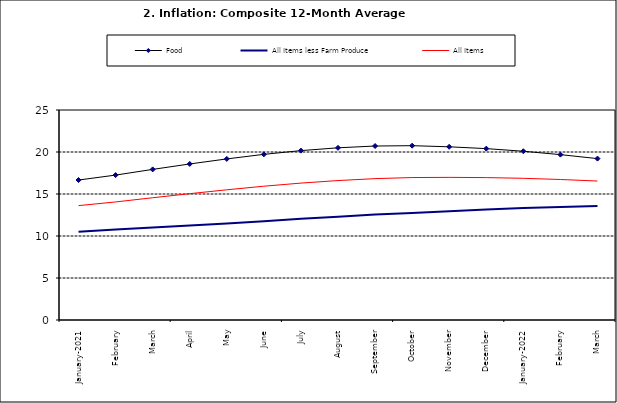
| Category | Food | All Items less Farm Produce | All Items |
|---|---|---|---|
| January-2021 | 16.662 | 10.519 | 13.616 |
| February | 17.251 | 10.767 | 14.053 |
| March | 17.929 | 11.015 | 14.554 |
| April | 18.576 | 11.247 | 15.039 |
| May | 19.176 | 11.502 | 15.499 |
| June | 19.721 | 11.75 | 15.927 |
| July | 20.165 | 12.052 | 16.298 |
| August | 20.499 | 12.291 | 16.601 |
| September | 20.711 | 12.553 | 16.83 |
| October | 20.753 | 12.725 | 16.958 |
| November | 20.619 | 12.956 | 16.979 |
| December | 20.403 | 13.161 | 16.953 |
| January-2022 | 20.089 | 13.326 | 16.869 |
| February | 19.687 | 13.461 | 16.728 |
| March | 19.214 | 13.562 | 16.544 |